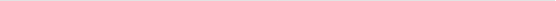
| Category | Contamination decrease | ROI |
|---|---|---|
| 0 | 0 | 0 |
| 1 | -0.05 | -166725.75 |
| 2 | -0.1 | -83359.5 |
| 3 | -0.129 | -35007.075 |
| 4 | -0.2 | 83373 |
| 5 | -0.3 | 250105.5 |
| 6 | -0.4 | 416838 |
| 7 | -0.5 | 583570.5 |